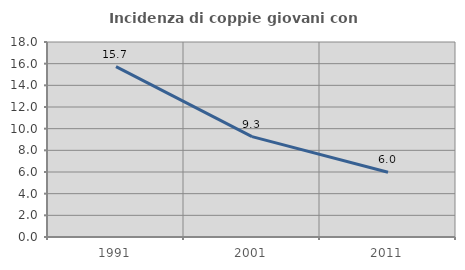
| Category | Incidenza di coppie giovani con figli |
|---|---|
| 1991.0 | 15.73 |
| 2001.0 | 9.264 |
| 2011.0 | 5.979 |